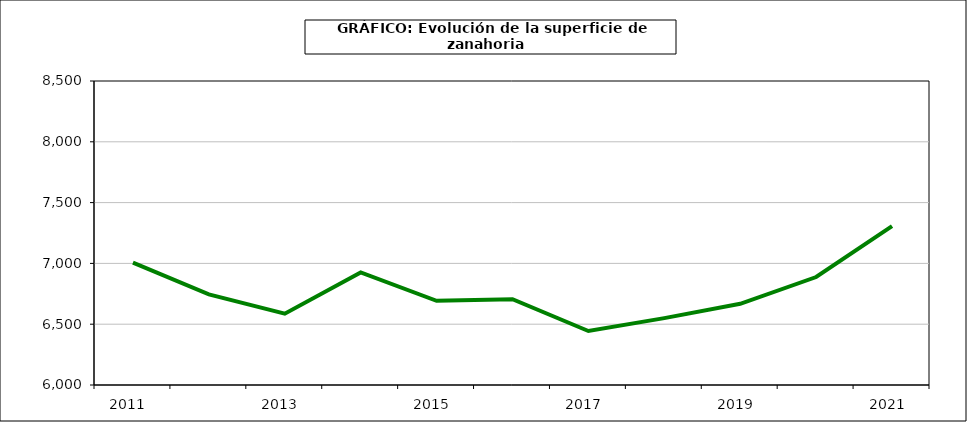
| Category | superficie |
|---|---|
| 2011.0 | 7006 |
| 2012.0 | 6745 |
| 2013.0 | 6586 |
| 2014.0 | 6926 |
| 2015.0 | 6692 |
| 2016.0 | 6705 |
| 2017.0 | 6444 |
| 2018.0 | 6550 |
| 2019.0 | 6668 |
| 2020.0 | 6888 |
| 2021.0 | 7307 |